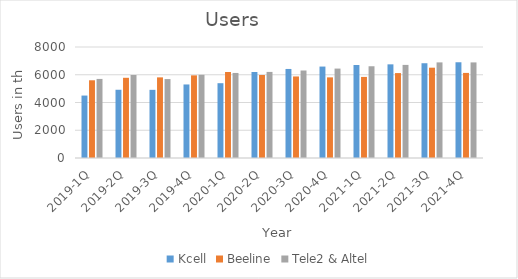
| Category | Kcell | Beeline | Tele2 & Altel |
|---|---|---|---|
| 2019-1Q | 4500 | 5601 | 5699 |
| 2019-2Q | 4918 | 5781 | 5982 |
| 2019-3Q | 4912 | 5811 | 5689 |
| 2019-4Q | 5300 | 5956 | 5996 |
| 2020-1Q | 5391 | 6199 | 6129 |
| 2020-2Q | 6199 | 5981 | 6204 |
| 2020-3Q | 6418 | 5877 | 6306 |
| 2020-4Q | 6590 | 5811 | 6445 |
| 2021-1Q | 6701 | 5844 | 6612 |
| 2021-2Q | 6750 | 6120 | 6710 |
| 2021-3Q | 6830 | 6509 | 6891 |
| 2021-4Q | 6900 | 6132 | 6890 |